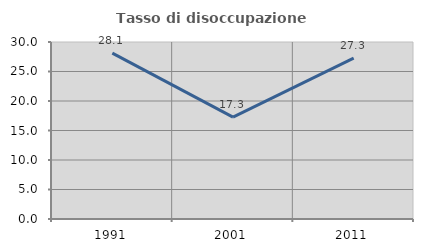
| Category | Tasso di disoccupazione giovanile  |
|---|---|
| 1991.0 | 28.125 |
| 2001.0 | 17.266 |
| 2011.0 | 27.273 |